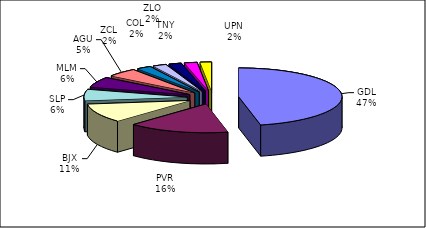
| Category | Series 0 |
|---|---|
| GDL | 164661 |
| PVR | 55763 |
| BJX | 37648 |
| SLP | 22365 |
| MLM | 20184 |
| AGU | 17033 |
| ZCL | 7984 |
| COL | 7538 |
| TNY | 6992 |
| ZLO | 7047 |
| UPN | 6249 |